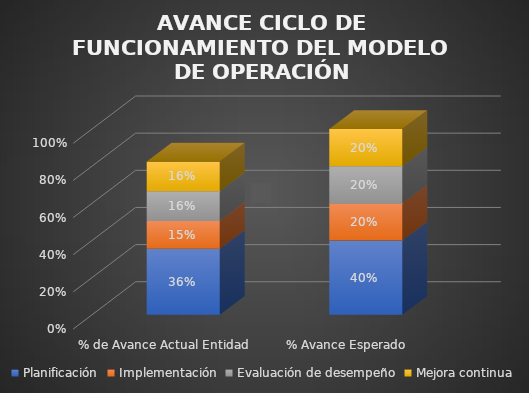
| Category | Planificación | Implementación | Evaluación de desempeño | Mejora continua |
|---|---|---|---|---|
| % de Avance Actual Entidad | 0.356 | 0.15 | 0.16 | 0.16 |
| % Avance Esperado | 0.4 | 0.2 | 0.2 | 0.2 |